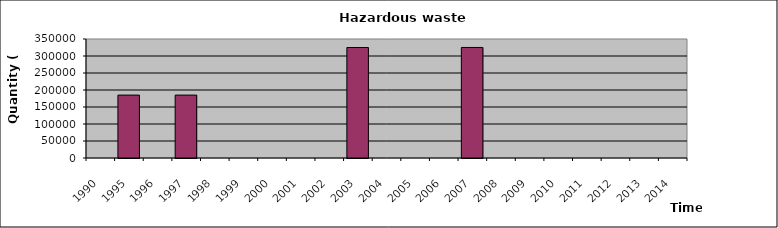
| Category | Series 1 |
|---|---|
| 1990.0 | 0 |
| 1995.0 | 185000 |
| 1996.0 | 0 |
| 1997.0 | 185000 |
| 1998.0 | 0 |
| 1999.0 | 0 |
| 2000.0 | 0 |
| 2001.0 | 0 |
| 2002.0 | 0 |
| 2003.0 | 325000 |
| 2004.0 | 0 |
| 2005.0 | 0 |
| 2006.0 | 0 |
| 2007.0 | 325100 |
| 2008.0 | 0 |
| 2009.0 | 0 |
| 2010.0 | 0 |
| 2011.0 | 0 |
| 2012.0 | 0 |
| 2013.0 | 0 |
| 2014.0 | 0 |